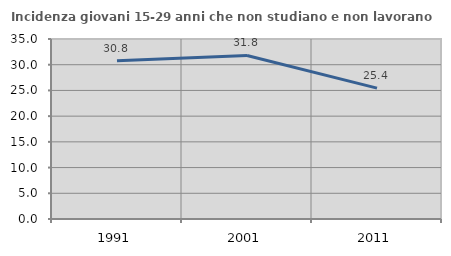
| Category | Incidenza giovani 15-29 anni che non studiano e non lavorano  |
|---|---|
| 1991.0 | 30.769 |
| 2001.0 | 31.806 |
| 2011.0 | 25.442 |